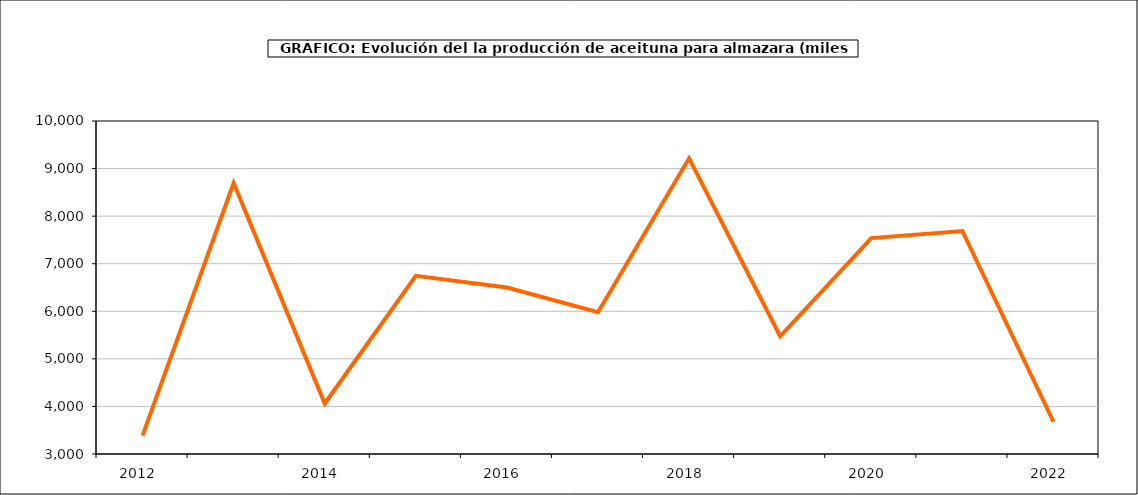
| Category | producción |
|---|---|
| 2012.0 | 3387.3 |
| 2013.0 | 8695.861 |
| 2014.0 | 4060.978 |
| 2015.0 | 6745.306 |
| 2016.0 | 6499.902 |
| 2017.0 | 5979.204 |
| 2018.0 | 9215.5 |
| 2019.0 | 5475.356 |
| 2020.0 | 7538.91 |
| 2021.0 | 7687.565 |
| 2022.0 | 3677.791 |